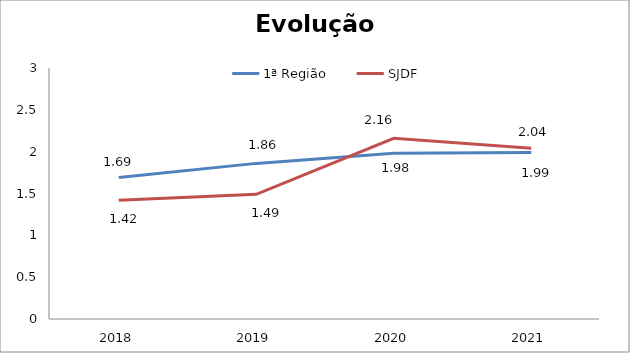
| Category | 1ª Região | SJDF |
|---|---|---|
| 0 | 1.69 | 1.42 |
| 1 | 1.86 | 1.49 |
| 2 | 1.98 | 2.16 |
| 3 | 1.99 | 2.04 |